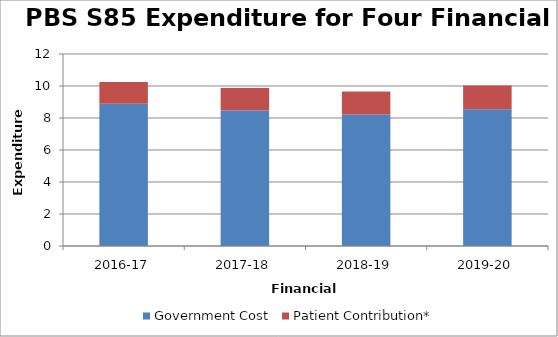
| Category | Government Cost | Patient Contribution* |
|---|---|---|
| 2016-17 | 8890241686.08 | 1366216380.9 |
| 2017-18 | 8464094754.23 | 1415449912.77 |
| 2018-19 | 8211729252.39 | 1440195121.79 |
| 2019-20 | 8552660248.36 | 1471034035.91 |